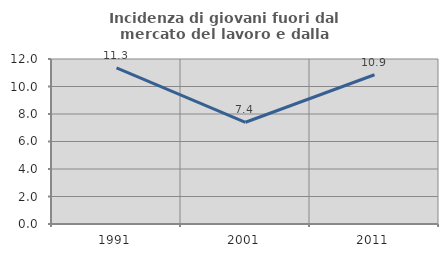
| Category | Incidenza di giovani fuori dal mercato del lavoro e dalla formazione  |
|---|---|
| 1991.0 | 11.348 |
| 2001.0 | 7.399 |
| 2011.0 | 10.855 |